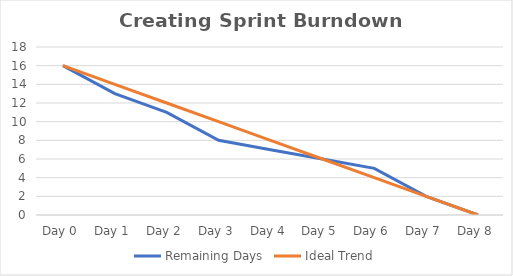
| Category | Remaining Days | Ideal Trend |
|---|---|---|
| Day 0 | 16 | 16 |
| Day 1 | 13 | 14 |
| Day 2 | 11 | 12 |
| Day 3 | 8 | 10 |
| Day 4 | 7 | 8 |
| Day 5 | 6 | 6 |
| Day 6 | 5 | 4 |
| Day 7 | 2 | 2 |
| Day 8 | 0 | 0 |